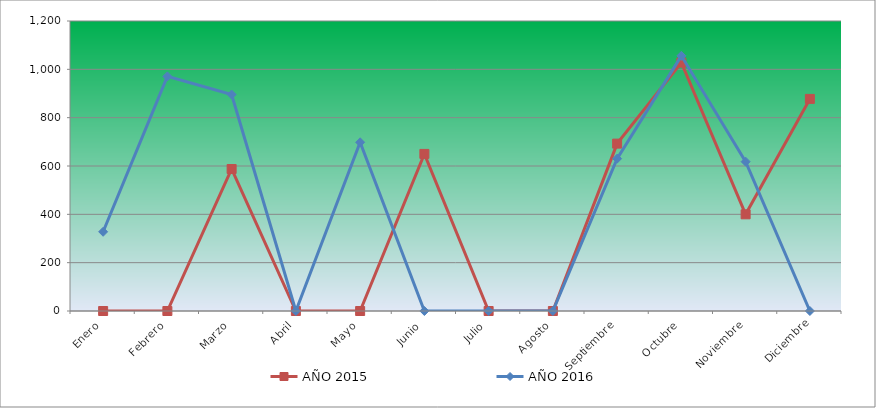
| Category | AÑO 2015 | AÑO 2016 |
|---|---|---|
| Enero | 0 | 327.751 |
| Febrero | 0 | 970.744 |
| Marzo | 587.591 | 895.686 |
| Abril | 0 | 0 |
| Mayo | 0 | 698.035 |
| Junio | 650.1 | 0 |
| Julio | 0 | 0 |
| Agosto | 0 | 0 |
| Septiembre | 692.607 | 630.483 |
| Octubre | 1027.658 | 1055.809 |
| Noviembre | 400.062 | 617.973 |
| Diciembre | 877.635 | 0 |